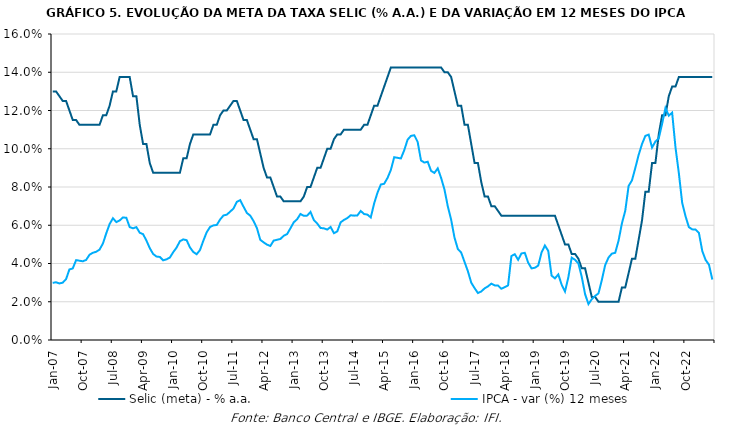
| Category | Selic (meta) - % a.a. | IPCA - var (%) 12 meses |
|---|---|---|
| 2007-01-01 | 0.13 | 0.03 |
| 2007-02-01 | 0.13 | 0.03 |
| 2007-03-01 | 0.128 | 0.03 |
| 2007-04-01 | 0.125 | 0.03 |
| 2007-05-01 | 0.125 | 0.032 |
| 2007-06-01 | 0.12 | 0.037 |
| 2007-07-01 | 0.115 | 0.037 |
| 2007-08-01 | 0.115 | 0.042 |
| 2007-09-01 | 0.112 | 0.041 |
| 2007-10-01 | 0.112 | 0.041 |
| 2007-11-01 | 0.112 | 0.042 |
| 2007-12-01 | 0.112 | 0.045 |
| 2008-01-01 | 0.112 | 0.046 |
| 2008-02-01 | 0.112 | 0.046 |
| 2008-03-01 | 0.112 | 0.047 |
| 2008-04-01 | 0.118 | 0.05 |
| 2008-05-01 | 0.118 | 0.056 |
| 2008-06-01 | 0.122 | 0.061 |
| 2008-07-01 | 0.13 | 0.064 |
| 2008-08-01 | 0.13 | 0.062 |
| 2008-09-01 | 0.138 | 0.063 |
| 2008-10-01 | 0.138 | 0.064 |
| 2008-11-01 | 0.138 | 0.064 |
| 2008-12-01 | 0.138 | 0.059 |
| 2009-01-01 | 0.128 | 0.058 |
| 2009-02-01 | 0.128 | 0.059 |
| 2009-03-01 | 0.112 | 0.056 |
| 2009-04-01 | 0.102 | 0.055 |
| 2009-05-01 | 0.102 | 0.052 |
| 2009-06-01 | 0.092 | 0.048 |
| 2009-07-01 | 0.088 | 0.045 |
| 2009-08-01 | 0.088 | 0.044 |
| 2009-09-01 | 0.088 | 0.043 |
| 2009-10-01 | 0.088 | 0.042 |
| 2009-11-01 | 0.088 | 0.042 |
| 2009-12-01 | 0.088 | 0.043 |
| 2010-01-01 | 0.088 | 0.046 |
| 2010-02-01 | 0.088 | 0.048 |
| 2010-03-01 | 0.088 | 0.052 |
| 2010-04-01 | 0.095 | 0.053 |
| 2010-05-01 | 0.095 | 0.052 |
| 2010-06-01 | 0.102 | 0.048 |
| 2010-07-01 | 0.108 | 0.046 |
| 2010-08-01 | 0.108 | 0.045 |
| 2010-09-01 | 0.108 | 0.047 |
| 2010-10-01 | 0.108 | 0.052 |
| 2010-11-01 | 0.108 | 0.056 |
| 2010-12-01 | 0.108 | 0.059 |
| 2011-01-01 | 0.112 | 0.06 |
| 2011-02-01 | 0.112 | 0.06 |
| 2011-03-01 | 0.118 | 0.063 |
| 2011-04-01 | 0.12 | 0.065 |
| 2011-05-01 | 0.12 | 0.066 |
| 2011-06-01 | 0.122 | 0.067 |
| 2011-07-01 | 0.125 | 0.069 |
| 2011-08-01 | 0.125 | 0.072 |
| 2011-09-01 | 0.12 | 0.073 |
| 2011-10-01 | 0.115 | 0.07 |
| 2011-11-01 | 0.115 | 0.066 |
| 2011-12-01 | 0.11 | 0.065 |
| 2012-01-01 | 0.105 | 0.062 |
| 2012-02-01 | 0.105 | 0.058 |
| 2012-03-01 | 0.098 | 0.052 |
| 2012-04-01 | 0.09 | 0.051 |
| 2012-05-01 | 0.085 | 0.05 |
| 2012-06-01 | 0.085 | 0.049 |
| 2012-07-01 | 0.08 | 0.052 |
| 2012-08-01 | 0.075 | 0.052 |
| 2012-09-01 | 0.075 | 0.053 |
| 2012-10-01 | 0.072 | 0.054 |
| 2012-11-01 | 0.072 | 0.055 |
| 2012-12-01 | 0.072 | 0.058 |
| 2013-01-01 | 0.072 | 0.062 |
| 2013-02-01 | 0.072 | 0.063 |
| 2013-03-01 | 0.072 | 0.066 |
| 2013-04-01 | 0.075 | 0.065 |
| 2013-05-01 | 0.08 | 0.065 |
| 2013-06-01 | 0.08 | 0.067 |
| 2013-07-01 | 0.085 | 0.063 |
| 2013-08-01 | 0.09 | 0.061 |
| 2013-09-01 | 0.09 | 0.059 |
| 2013-10-01 | 0.095 | 0.058 |
| 2013-11-01 | 0.1 | 0.058 |
| 2013-12-01 | 0.1 | 0.059 |
| 2014-01-01 | 0.105 | 0.056 |
| 2014-02-01 | 0.108 | 0.057 |
| 2014-03-01 | 0.108 | 0.062 |
| 2014-04-01 | 0.11 | 0.063 |
| 2014-05-01 | 0.11 | 0.064 |
| 2014-06-01 | 0.11 | 0.065 |
| 2014-07-01 | 0.11 | 0.065 |
| 2014-08-01 | 0.11 | 0.065 |
| 2014-09-01 | 0.11 | 0.067 |
| 2014-10-01 | 0.112 | 0.066 |
| 2014-11-01 | 0.112 | 0.066 |
| 2014-12-01 | 0.118 | 0.064 |
| 2015-01-01 | 0.122 | 0.071 |
| 2015-02-01 | 0.122 | 0.077 |
| 2015-03-01 | 0.128 | 0.081 |
| 2015-04-01 | 0.132 | 0.082 |
| 2015-05-01 | 0.138 | 0.085 |
| 2015-06-01 | 0.142 | 0.089 |
| 2015-07-01 | 0.142 | 0.096 |
| 2015-08-01 | 0.142 | 0.095 |
| 2015-09-01 | 0.142 | 0.095 |
| 2015-10-01 | 0.142 | 0.099 |
| 2015-11-01 | 0.142 | 0.105 |
| 2015-12-01 | 0.142 | 0.107 |
| 2016-01-01 | 0.142 | 0.107 |
| 2016-02-01 | 0.142 | 0.104 |
| 2016-03-01 | 0.142 | 0.094 |
| 2016-04-01 | 0.142 | 0.093 |
| 2016-05-01 | 0.142 | 0.093 |
| 2016-06-01 | 0.142 | 0.088 |
| 2016-07-01 | 0.142 | 0.087 |
| 2016-08-01 | 0.142 | 0.09 |
| 2016-09-01 | 0.142 | 0.085 |
| 2016-10-01 | 0.14 | 0.079 |
| 2016-11-01 | 0.14 | 0.07 |
| 2016-12-01 | 0.138 | 0.063 |
| 2017-01-01 | 0.13 | 0.054 |
| 2017-02-01 | 0.122 | 0.048 |
| 2017-03-01 | 0.122 | 0.046 |
| 2017-04-01 | 0.112 | 0.041 |
| 2017-05-01 | 0.112 | 0.036 |
| 2017-06-01 | 0.102 | 0.03 |
| 2017-07-01 | 0.092 | 0.027 |
| 2017-08-01 | 0.092 | 0.025 |
| 2017-09-01 | 0.082 | 0.025 |
| 2017-10-01 | 0.075 | 0.027 |
| 2017-11-01 | 0.075 | 0.028 |
| 2017-12-01 | 0.07 | 0.029 |
| 2018-01-01 | 0.07 | 0.029 |
| 2018-02-01 | 0.068 | 0.028 |
| 2018-03-01 | 0.065 | 0.027 |
| 2018-04-01 | 0.065 | 0.028 |
| 2018-05-01 | 0.065 | 0.029 |
| 2018-06-01 | 0.065 | 0.044 |
| 2018-07-01 | 0.065 | 0.045 |
| 2018-08-01 | 0.065 | 0.042 |
| 2018-09-01 | 0.065 | 0.045 |
| 2018-10-01 | 0.065 | 0.046 |
| 2018-11-01 | 0.065 | 0.04 |
| 2018-12-01 | 0.065 | 0.037 |
| 2019-01-01 | 0.065 | 0.038 |
| 2019-02-01 | 0.065 | 0.039 |
| 2019-03-01 | 0.065 | 0.046 |
| 2019-04-01 | 0.065 | 0.049 |
| 2019-05-01 | 0.065 | 0.047 |
| 2019-06-01 | 0.065 | 0.034 |
| 2019-07-01 | 0.065 | 0.032 |
| 2019-08-01 | 0.06 | 0.034 |
| 2019-09-01 | 0.055 | 0.029 |
| 2019-10-01 | 0.05 | 0.025 |
| 2019-11-01 | 0.05 | 0.033 |
| 2019-12-01 | 0.045 | 0.043 |
| 2020-01-01 | 0.045 | 0.042 |
| 2020-02-01 | 0.042 | 0.04 |
| 2020-03-01 | 0.038 | 0.033 |
| 2020-04-01 | 0.038 | 0.024 |
| 2020-05-01 | 0.03 | 0.019 |
| 2020-06-01 | 0.022 | 0.021 |
| 2020-07-01 | 0.022 | 0.023 |
| 2020-08-01 | 0.02 | 0.024 |
| 2020-09-01 | 0.02 | 0.031 |
| 2020-10-01 | 0.02 | 0.039 |
| 2020-11-01 | 0.02 | 0.043 |
| 2020-12-01 | 0.02 | 0.045 |
| 2021-01-01 | 0.02 | 0.046 |
| 2021-02-01 | 0.02 | 0.052 |
| 2021-03-01 | 0.028 | 0.061 |
| 2021-04-01 | 0.028 | 0.068 |
| 2021-05-01 | 0.035 | 0.081 |
| 2021-06-01 | 0.042 | 0.083 |
| 2021-07-01 | 0.042 | 0.09 |
| 2021-08-01 | 0.052 | 0.097 |
| 2021-09-01 | 0.062 | 0.102 |
| 2021-10-01 | 0.078 | 0.107 |
| 2021-11-01 | 0.078 | 0.107 |
| 2021-12-01 | 0.092 | 0.101 |
| 2022-01-01 | 0.092 | 0.104 |
| 2022-02-01 | 0.108 | 0.105 |
| 2022-03-01 | 0.118 | 0.113 |
| 2022-04-01 | 0.118 | 0.121 |
| 2022-05-01 | 0.128 | 0.117 |
| 2022-06-01 | 0.132 | 0.119 |
| 2022-07-01 | 0.132 | 0.101 |
| 2022-08-01 | 0.138 | 0.087 |
| 2022-09-01 | 0.138 | 0.072 |
| 2022-10-01 | 0.138 | 0.065 |
| 2022-11-01 | 0.138 | 0.059 |
| 2022-12-01 | 0.138 | 0.058 |
| 2023-01-01 | 0.138 | 0.058 |
| 2023-02-01 | 0.138 | 0.056 |
| 2023-03-01 | 0.138 | 0.047 |
| 2023-04-01 | 0.138 | 0.042 |
| 2023-05-01 | 0.138 | 0.039 |
| 2023-06-01 | 0.138 | 0.032 |